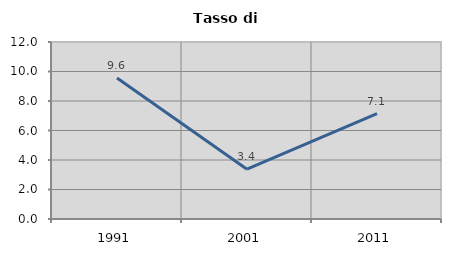
| Category | Tasso di disoccupazione   |
|---|---|
| 1991.0 | 9.562 |
| 2001.0 | 3.375 |
| 2011.0 | 7.146 |